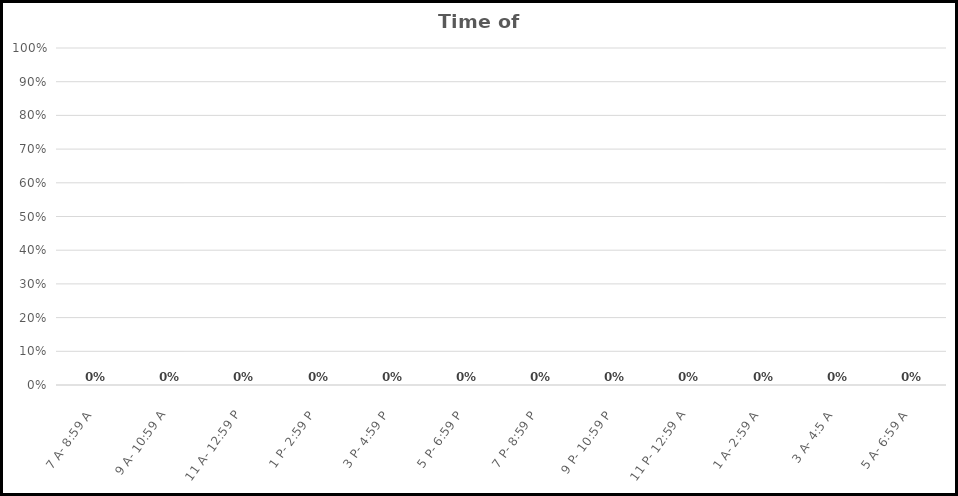
| Category | Time of Behavior Statistical Summary  |
|---|---|
| 7 A- 8:59 A | 0 |
| 9 A- 10:59 A | 0 |
| 11 A- 12:59 P | 0 |
| 1 P- 2:59 P | 0 |
| 3 P- 4:59 P | 0 |
| 5 P- 6:59 P | 0 |
| 7 P- 8:59 P | 0 |
| 9 P- 10:59 P | 0 |
| 11 P- 12:59 A | 0 |
| 1 A- 2:59 A | 0 |
| 3 A- 4:5 A | 0 |
| 5 A- 6:59 A | 0 |